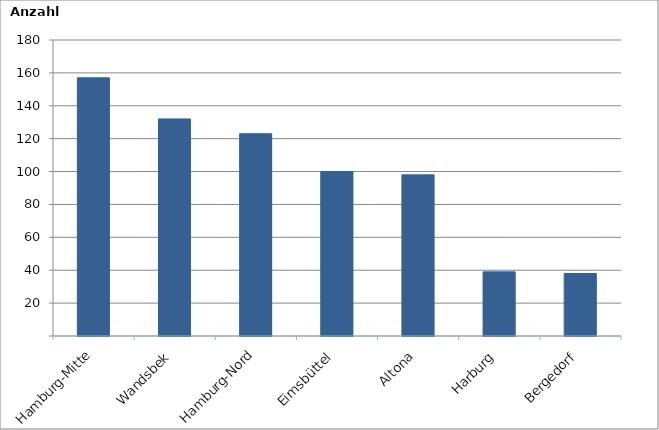
| Category | Series 0 |
|---|---|
| Hamburg-Mitte | 157 |
| Wandsbek | 132 |
| Hamburg-Nord | 123 |
| Eimsbüttel | 100 |
| Altona | 98 |
| Harburg | 39 |
| Bergedorf | 38 |